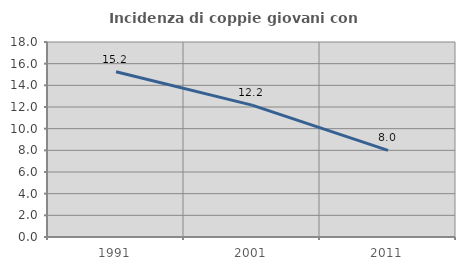
| Category | Incidenza di coppie giovani con figli |
|---|---|
| 1991.0 | 15.25 |
| 2001.0 | 12.171 |
| 2011.0 | 7.993 |